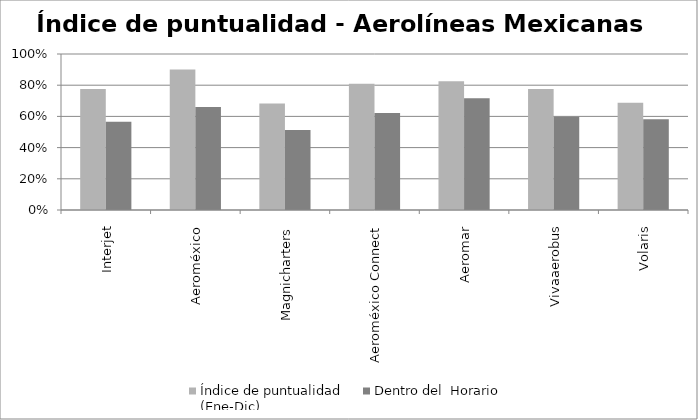
| Category | Índice de puntualidad
(Ene-Dic) | Dentro del  Horario |
|---|---|---|
| Interjet | 0.775 | 0.565 |
| Aeroméxico | 0.901 | 0.661 |
| Magnicharters | 0.683 | 0.513 |
| Aeroméxico Connect | 0.81 | 0.621 |
| Aeromar | 0.825 | 0.717 |
| Vivaaerobus | 0.775 | 0.598 |
| Volaris | 0.688 | 0.581 |